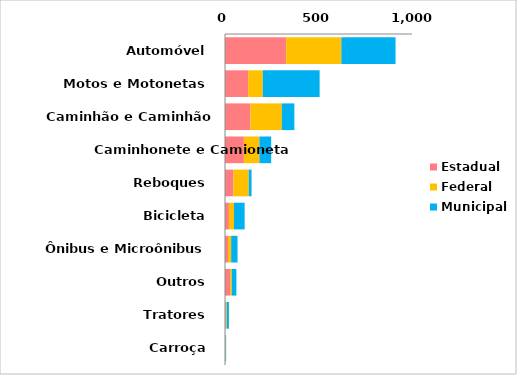
| Category | Estadual | Federal | Municipal |
|---|---|---|---|
| Automóvel | 327 | 295 | 290 |
| Motos e Motonetas | 124 | 78 | 304 |
| Caminhão e Caminhão Trator | 136 | 168 | 67 |
| Caminhonete e Camioneta | 101 | 83 | 63 |
| Reboques | 45 | 82 | 15 |
| Bicicleta | 21 | 27 | 57 |
| Ônibus e Microônibus | 16 | 17 | 34 |
| Outros | 27 | 9 | 25 |
| Tratores | 4 | 5 | 12 |
| Carroça | 0 | 3 | 3 |